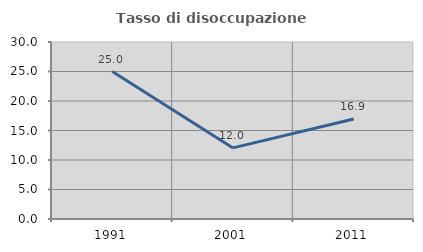
| Category | Tasso di disoccupazione giovanile  |
|---|---|
| 1991.0 | 25 |
| 2001.0 | 12.048 |
| 2011.0 | 16.949 |